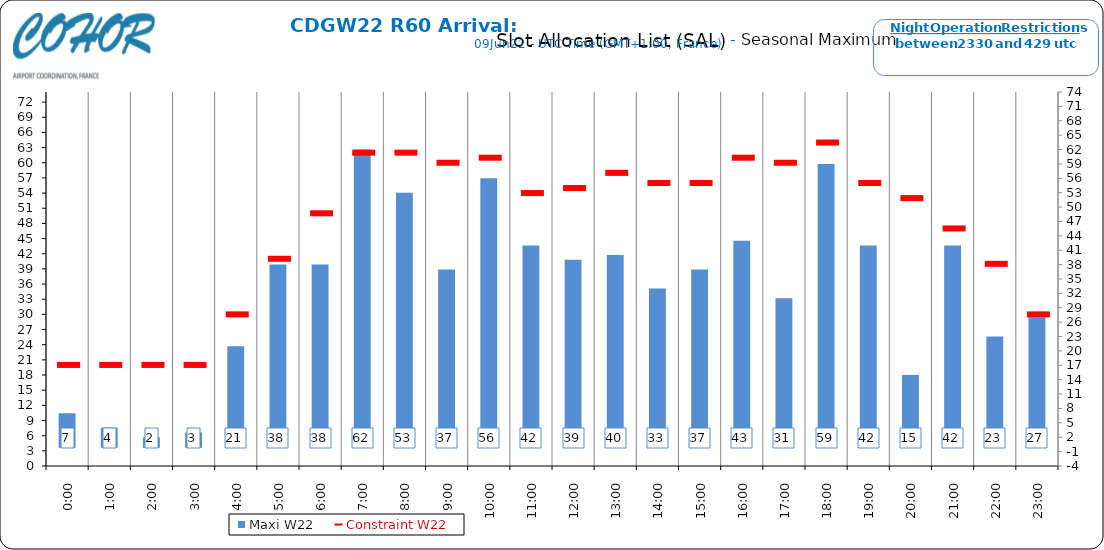
| Category | Maxi W22 |
|---|---|
| 0:00 | 7 |
| 1:00 | 4 |
| 2:00 | 2 |
| 3:00 | 3 |
| 4:00 | 21 |
| 5:00 | 38 |
| 6:00 | 38 |
| 7:00 | 62 |
| 8:00 | 53 |
| 9:00 | 37 |
| 10:00 | 56 |
| 11:00 | 42 |
| 12:00 | 39 |
| 13:00 | 40 |
| 14:00 | 33 |
| 15:00 | 37 |
| 16:00 | 43 |
| 17:00 | 31 |
| 18:00 | 59 |
| 19:00 | 42 |
| 20:00 | 15 |
| 21:00 | 42 |
| 22:00 | 23 |
| 23:00 | 27 |